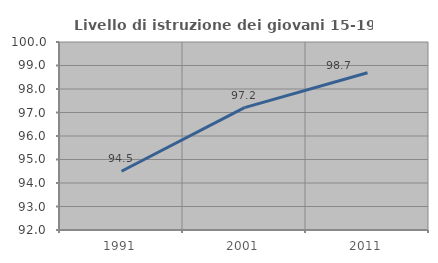
| Category | Livello di istruzione dei giovani 15-19 anni |
|---|---|
| 1991.0 | 94.498 |
| 2001.0 | 97.209 |
| 2011.0 | 98.69 |